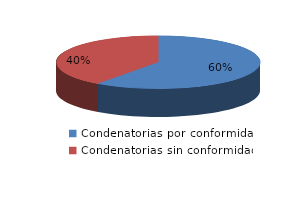
| Category | Series 0 |
|---|---|
| 0 | 6 |
| 1 | 4 |